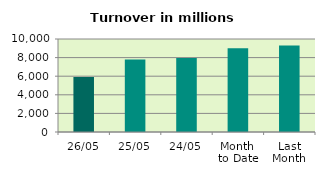
| Category | Series 0 |
|---|---|
| 26/05 | 5911.065 |
| 25/05 | 7786.638 |
| 24/05 | 7959.542 |
| Month 
to Date | 8999.502 |
| Last
Month | 9311.354 |